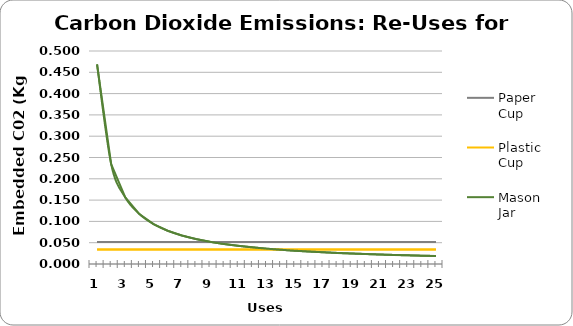
| Category | Paper Cup | Plastic Cup | Mason Jar |
|---|---|---|---|
| 0 | 0.052 | 0.034 | 0.469 |
| 1 | 0.052 | 0.034 | 0.234 |
| 2 | 0.052 | 0.034 | 0.156 |
| 3 | 0.052 | 0.034 | 0.117 |
| 4 | 0.052 | 0.034 | 0.094 |
| 5 | 0.052 | 0.034 | 0.078 |
| 6 | 0.052 | 0.034 | 0.067 |
| 7 | 0.052 | 0.034 | 0.059 |
| 8 | 0.052 | 0.034 | 0.052 |
| 9 | 0.052 | 0.034 | 0.047 |
| 10 | 0.052 | 0.034 | 0.043 |
| 11 | 0.052 | 0.034 | 0.039 |
| 12 | 0.052 | 0.034 | 0.036 |
| 13 | 0.052 | 0.034 | 0.033 |
| 14 | 0.052 | 0.034 | 0.031 |
| 15 | 0.052 | 0.034 | 0.029 |
| 16 | 0.052 | 0.034 | 0.028 |
| 17 | 0.052 | 0.034 | 0.026 |
| 18 | 0.052 | 0.034 | 0.025 |
| 19 | 0.052 | 0.034 | 0.023 |
| 20 | 0.052 | 0.034 | 0.022 |
| 21 | 0.052 | 0.034 | 0.021 |
| 22 | 0.052 | 0.034 | 0.02 |
| 23 | 0.052 | 0.034 | 0.02 |
| 24 | 0.052 | 0.034 | 0.019 |